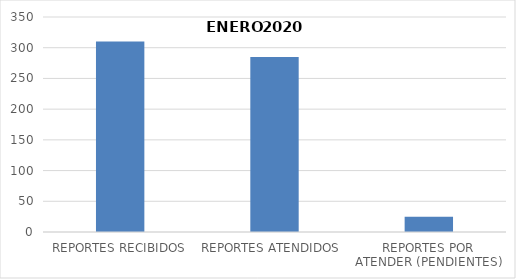
| Category | Series 0 |
|---|---|
| REPORTES RECIBIDOS | 310 |
| REPORTES ATENDIDOS  | 285 |
| REPORTES POR ATENDER (PENDIENTES) | 25 |